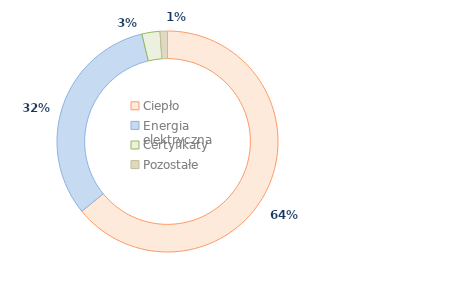
| Category | Series 0 |
|---|---|
| Ciepło | 64.129 |
| Energia elektryczna | 32.15 |
| Certyfikaty | 2.645 |
| Pozostałe | 1.076 |